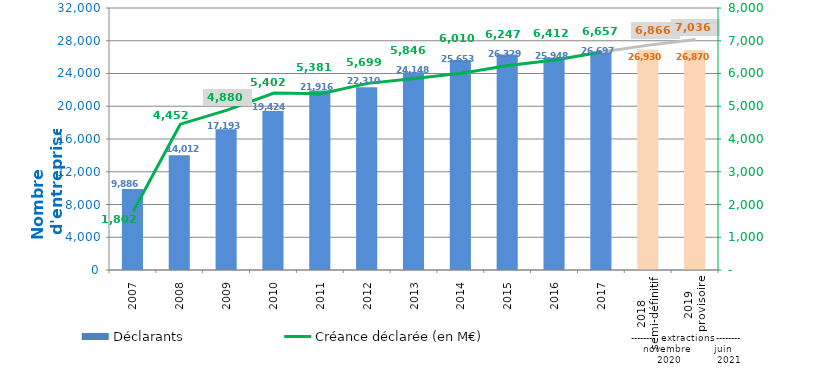
| Category | Déclarants |
|---|---|
| 2007 | 9886 |
| 2008 | 14012 |
| 2009 | 17193 |
| 2010 | 19424 |
| 2011 | 21916 |
| 2012 | 22310 |
| 2013 | 24148 |
| 2014 | 25653 |
| 2015 | 26329 |
| 2016 | 25948 |
| 2017 | 26697 |
| 2018
semi-définitif | 26930 |
| 2019
provisoire | 26870 |